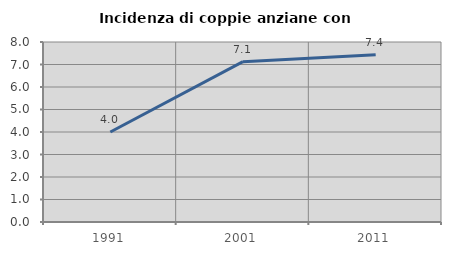
| Category | Incidenza di coppie anziane con figli |
|---|---|
| 1991.0 | 4 |
| 2001.0 | 7.127 |
| 2011.0 | 7.431 |